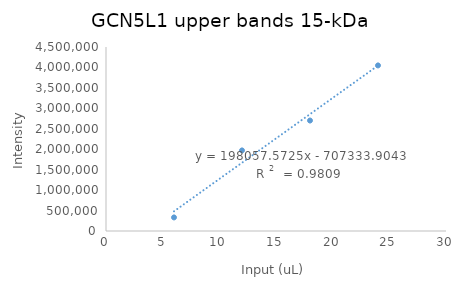
| Category | Series 0 |
|---|---|
| 18.0 | 2701671.776 |
| 6.0 | 332071.806 |
| 24.0 | 4049593.284 |
| 12.0 | 1970781.864 |